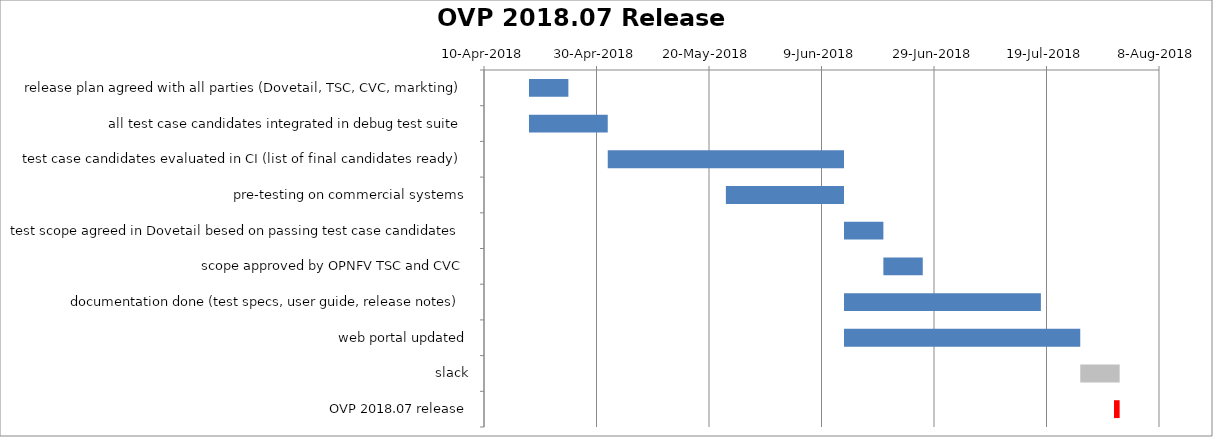
| Category | Start | Duration (days) |
|---|---|---|
| release plan agreed with all parties (Dovetail, TSC, CVC, markting) | 2018-04-18 | 7 |
| all test case candidates integrated in debug test suite | 2018-04-18 | 14 |
| test case candidates evaluated in CI (list of final candidates ready) | 2018-05-02 | 42 |
| pre-testing on commercial systems | 2018-05-23 | 21 |
| test scope agreed in Dovetail besed on passing test case candidates | 2018-06-13 | 7 |
| scope approved by OPNFV TSC and CVC | 2018-06-20 | 7 |
| documentation done (test specs, user guide, release notes) | 2018-06-13 | 35 |
| web portal updated | 2018-06-13 | 42 |
| slack | 2018-07-25 | 7 |
| OVP 2018.07 release | 2018-07-31 | 1 |